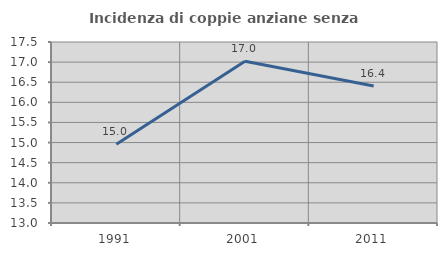
| Category | Incidenza di coppie anziane senza figli  |
|---|---|
| 1991.0 | 14.957 |
| 2001.0 | 17.021 |
| 2011.0 | 16.406 |